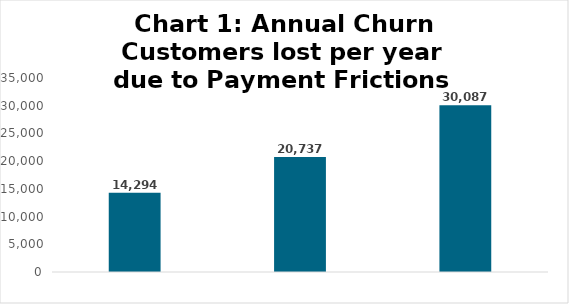
| Category | Series 0 |
|---|---|
|  | 14294.215 |
|  | 20737.048 |
|  | 30086.919 |